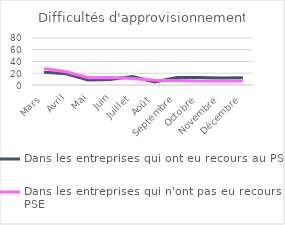
| Category | Dans les entreprises qui ont eu recours au PSE  | Dans les entreprises qui n'ont pas eu recours au PSE  |
|---|---|---|
| Mars | 21.882 | 28.01 |
| Avril | 19.175 | 22.654 |
| Mai | 8.414 | 12.514 |
| Juin | 9.236 | 12.559 |
| Juillet | 14.462 | 11.088 |
| Août | 5.321 | 7.993 |
| Septembre | 12.876 | 7.848 |
| Octobre | 12.917 | 6.762 |
| Novembre | 11.775 | 6.804 |
| Décembre | 12.533 | 6.968 |